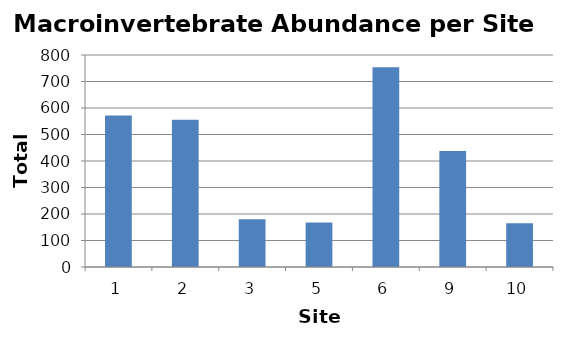
| Category | Abundance |
|---|---|
| 1.0 | 572 |
| 2.0 | 556 |
| 3.0 | 180 |
| 5.0 | 168 |
| 6.0 | 754 |
| 9.0 | 438 |
| 10.0 | 165 |